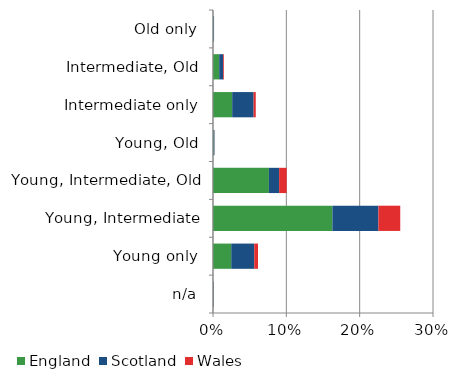
| Category | England | Scotland | Wales |
|---|---|---|---|
| n/a | 0 | 0.001 | 0 |
| Young only | 0.025 | 0.031 | 0.005 |
| Young, Intermediate | 0.163 | 0.063 | 0.03 |
| Young, Intermediate, Old | 0.076 | 0.014 | 0.01 |
| Young, Old | 0.001 | 0.001 | 0 |
| Intermediate only | 0.026 | 0.029 | 0.003 |
| Intermediate, Old | 0.008 | 0.005 | 0.001 |
| Old only | 0.001 | 0.001 | 0 |